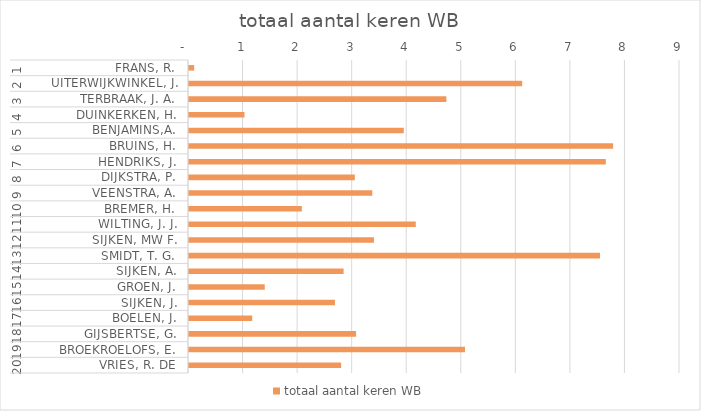
| Category | totaal aantal keren WB |
|---|---|
| 0 | 0.095 |
| 1 | 6.108 |
| 2 | 4.717 |
| 3 | 1.017 |
| 4 | 3.937 |
| 5 | 7.774 |
| 6 | 7.64 |
| 7 | 3.04 |
| 8 | 3.36 |
| 9 | 2.069 |
| 10 | 4.157 |
| 11 | 3.391 |
| 12 | 7.534 |
| 13 | 2.834 |
| 14 | 1.388 |
| 15 | 2.676 |
| 16 | 1.159 |
| 17 | 3.063 |
| 18 | 5.059 |
| 19 | 2.789 |